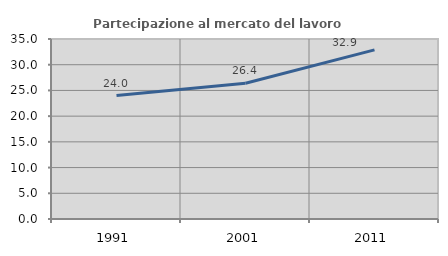
| Category | Partecipazione al mercato del lavoro  femminile |
|---|---|
| 1991.0 | 24.007 |
| 2001.0 | 26.397 |
| 2011.0 | 32.892 |